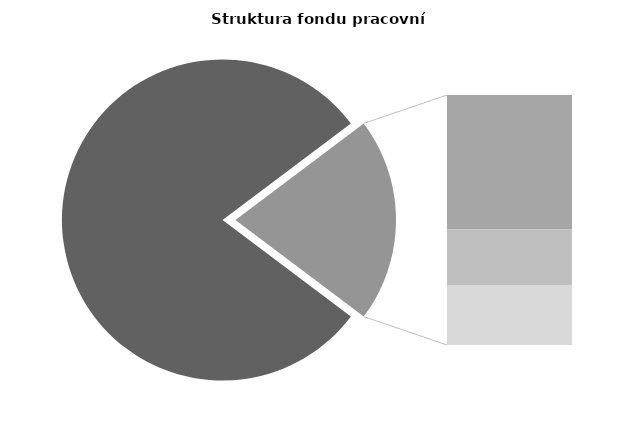
| Category | Series 0 |
|---|---|
| Průměrná měsíční 
odpracovaná doba  
bez přesčasu | 136.536 |
| Dovolená | 18.964 |
| Nemoc | 7.84 |
| Jiné | 8.479 |